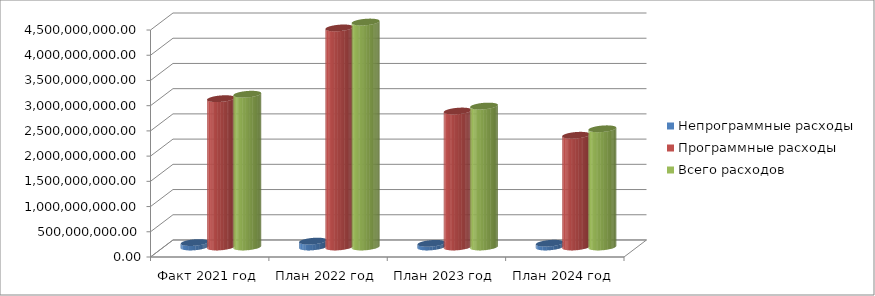
| Category | Непрограммные расходы | Программные расходы | Всего расходов |
|---|---|---|---|
| Факт 2021 год | 88271042.59 | 2940800625.65 | 3029071668.24 |
| План 2022 год | 116875279.55 | 4343425191.91 | 4460300471.46 |
| План 2023 год | 72387394 | 2696109639.93 | 2794497033.93 |
| План 2024 год | 74924210 | 2215374283.59 | 2343898493.59 |